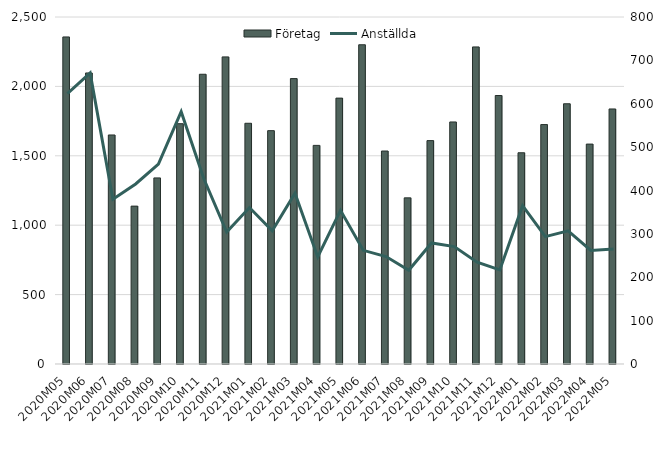
| Category | Företag |
|---|---|
| 2020M05 | 754 |
| 2020M06 | 671 |
| 2020M07 | 528 |
| 2020M08 | 364 |
| 2020M09 | 429 |
| 2020M10 | 554 |
| 2020M11 | 668 |
| 2020M12 | 708 |
| 2021M01 | 555 |
| 2021M02 | 538 |
| 2021M03 | 658 |
| 2021M04 | 504 |
| 2021M05 | 613 |
| 2021M06 | 736 |
| 2021M07 | 491 |
| 2021M08 | 383 |
| 2021M09 | 515 |
| 2021M10 | 558 |
| 2021M11 | 731 |
| 2021M12 | 619 |
| 2022M01 | 487 |
| 2022M02 | 552 |
| 2022M03 | 600 |
| 2022M04 | 507 |
| 2022M05 | 588 |